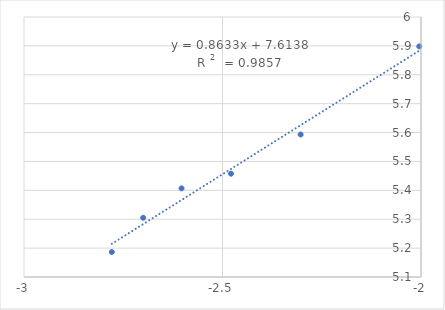
| Category | Series 0 |
|---|---|
| -2.0043213737826426 | 5.898 |
| -2.303196057420489 | 5.593 |
| -2.4785664955938436 | 5.458 |
| -2.603144372620182 | 5.407 |
| -2.699837725867246 | 5.305 |
| -2.7788744720027396 | 5.186 |